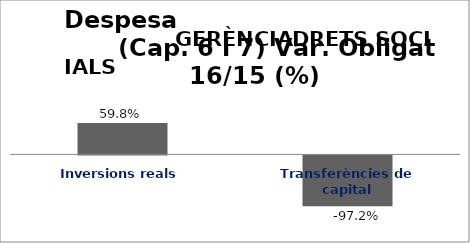
| Category | Series 0 |
|---|---|
| Inversions reals | 0.598 |
| Transferències de capital | -0.972 |